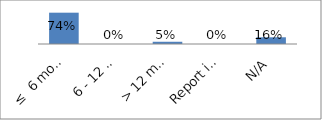
| Category | Series 0 |
|---|---|
| ≤  6 months after the end of the FY | 0.737 |
| 6 - 12 months after the end of the FY | 0 |
| > 12 months after the end of the FY | 0.053 |
| Report is not released | 0 |
| N/A | 0.158 |